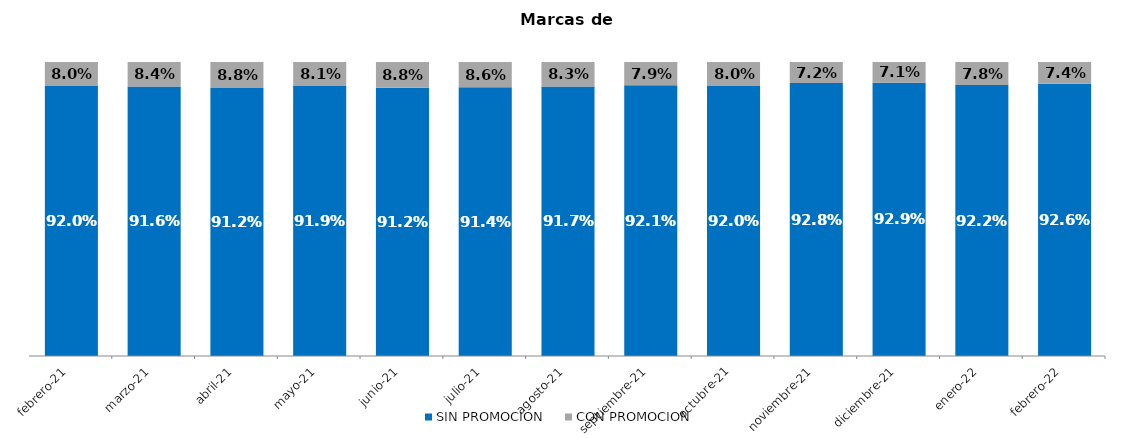
| Category | SIN PROMOCION   | CON PROMOCION   |
|---|---|---|
| 2021-02-01 | 0.92 | 0.08 |
| 2021-03-01 | 0.916 | 0.084 |
| 2021-04-01 | 0.912 | 0.088 |
| 2021-05-01 | 0.919 | 0.081 |
| 2021-06-01 | 0.912 | 0.088 |
| 2021-07-01 | 0.914 | 0.086 |
| 2021-08-01 | 0.917 | 0.083 |
| 2021-09-01 | 0.921 | 0.079 |
| 2021-10-01 | 0.92 | 0.08 |
| 2021-11-01 | 0.928 | 0.072 |
| 2021-12-01 | 0.929 | 0.071 |
| 2022-01-01 | 0.922 | 0.078 |
| 2022-02-01 | 0.926 | 0.074 |